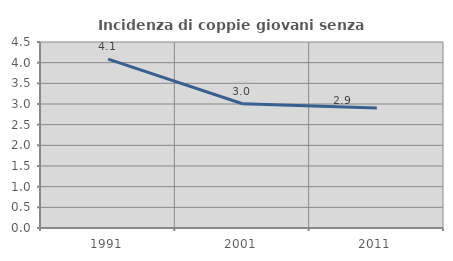
| Category | Incidenza di coppie giovani senza figli |
|---|---|
| 1991.0 | 4.086 |
| 2001.0 | 3.007 |
| 2011.0 | 2.906 |